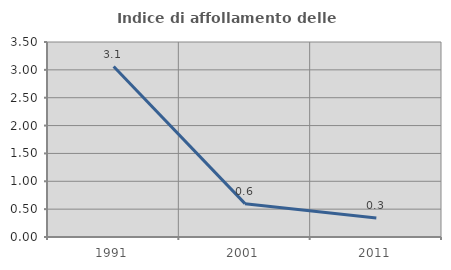
| Category | Indice di affollamento delle abitazioni  |
|---|---|
| 1991.0 | 3.059 |
| 2001.0 | 0.599 |
| 2011.0 | 0.339 |